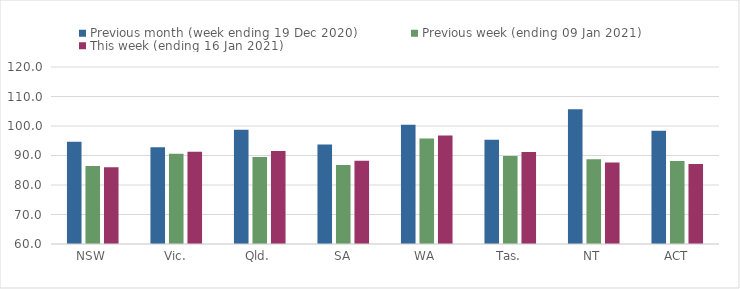
| Category | Previous month (week ending 19 Dec 2020) | Previous week (ending 09 Jan 2021) | This week (ending 16 Jan 2021) |
|---|---|---|---|
| NSW | 94.66 | 86.4 | 85.99 |
| Vic. | 92.78 | 90.62 | 91.26 |
| Qld. | 98.71 | 89.52 | 91.51 |
| SA | 93.71 | 86.76 | 88.21 |
| WA | 100.41 | 95.79 | 96.82 |
| Tas. | 95.34 | 89.82 | 91.15 |
| NT | 105.64 | 88.71 | 87.61 |
| ACT | 98.38 | 88.12 | 87.16 |